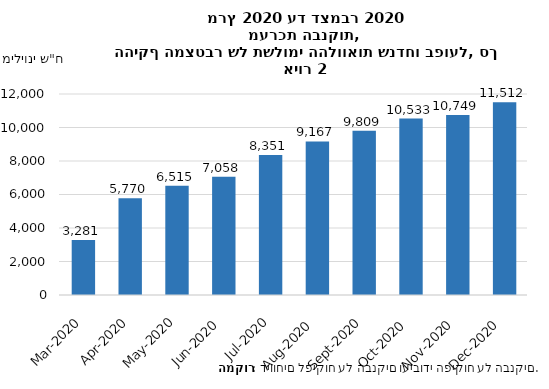
| Category | יתרת התשלומים שנדחו בפועל (מיליוני ₪) |
|---|---|
| דצמ-20 | 11511.571 |
| נוב-20 | 10748.528 |
| אוק-20 | 10533.494 |
| ספט-20 | 9808.811 |
| אוג-20 | 9166.653 |
| יול-20 | 8350.842 |
| יונ-20 | 7057.64 |
| מאי-20 | 6515.149 |
| אפר-20 | 5770 |
| מרץ-20 | 3280.708 |